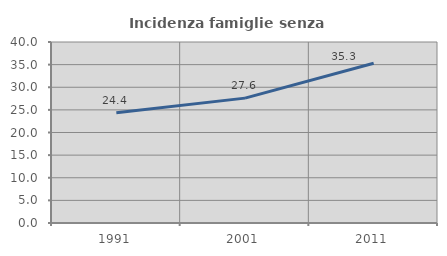
| Category | Incidenza famiglie senza nuclei |
|---|---|
| 1991.0 | 24.356 |
| 2001.0 | 27.598 |
| 2011.0 | 35.294 |